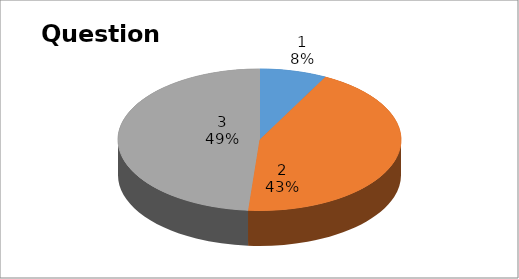
| Category | Series 0 |
|---|---|
| 0 | 3 |
| 1 | 17 |
| 2 | 19 |